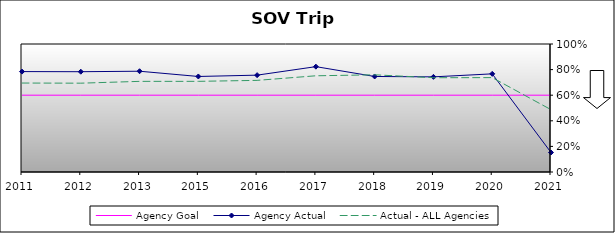
| Category | Agency Goal | Agency Actual | Actual - ALL Agencies |
|---|---|---|---|
| 2011.0 | 0.6 | 0.784 | 0.695 |
| 2012.0 | 0.6 | 0.784 | 0.694 |
| 2013.0 | 0.6 | 0.787 | 0.708 |
| 2015.0 | 0.6 | 0.746 | 0.708 |
| 2016.0 | 0.6 | 0.757 | 0.716 |
| 2017.0 | 0.6 | 0.823 | 0.752 |
| 2018.0 | 0.6 | 0.746 | 0.759 |
| 2019.0 | 0.6 | 0.743 | 0.736 |
| 2020.0 | 0.6 | 0.767 | 0.737 |
| 2021.0 | 0.6 | 0.152 | 0.487 |